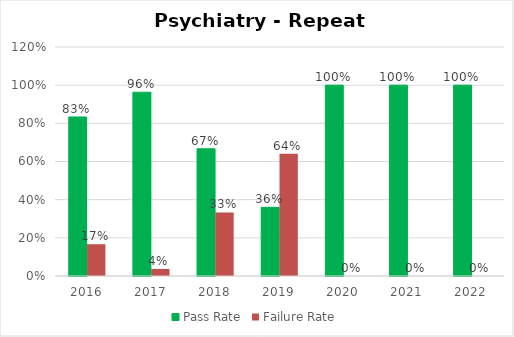
| Category | Pass Rate | Failure Rate |
|---|---|---|
| 2016.0 | 0.833 | 0.167 |
| 2017.0 | 0.963 | 0.037 |
| 2018.0 | 0.667 | 0.333 |
| 2019.0 | 0.36 | 0.64 |
| 2020.0 | 1 | 0 |
| 2021.0 | 1 | 0 |
| 2022.0 | 1 | 0 |